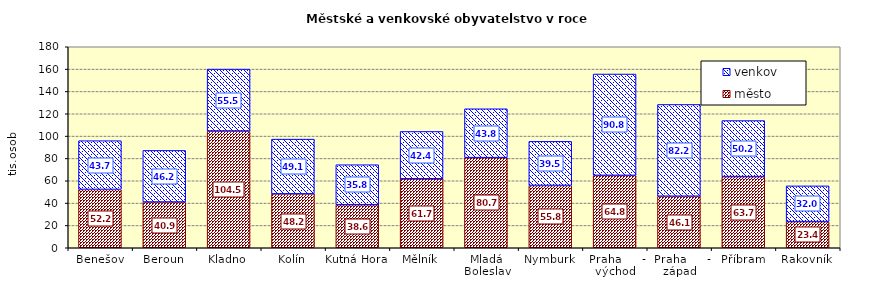
| Category | město | venkov |
|---|---|---|
| Benešov | 52223 | 43660 |
| Beroun | 40945 | 46239 |
| Kladno | 104517 | 55467 |
| Kolín | 48222 | 49057 |
| Kutná Hora | 38575 | 35784 |
| Mělník | 61717 | 42431 |
| Mladá Boleslav | 80692 | 43778 |
| Nymburk | 55764 | 39515 |
| Praha     - východ | 64822 | 90766 |
| Praha     - západ | 46136 | 82190 |
| Příbram | 63699 | 50206 |
| Rakovník | 23415 | 31996 |